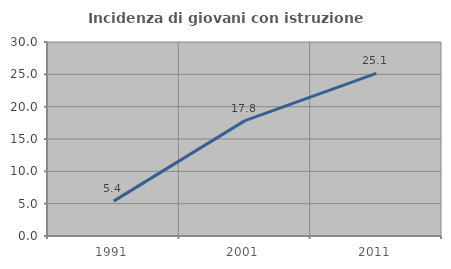
| Category | Incidenza di giovani con istruzione universitaria |
|---|---|
| 1991.0 | 5.394 |
| 2001.0 | 17.844 |
| 2011.0 | 25.148 |